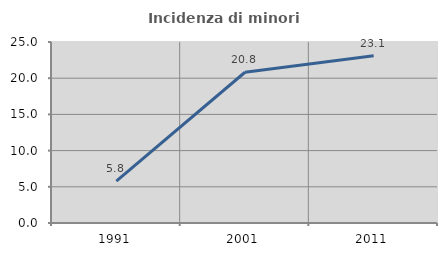
| Category | Incidenza di minori stranieri |
|---|---|
| 1991.0 | 5.797 |
| 2001.0 | 20.82 |
| 2011.0 | 23.088 |